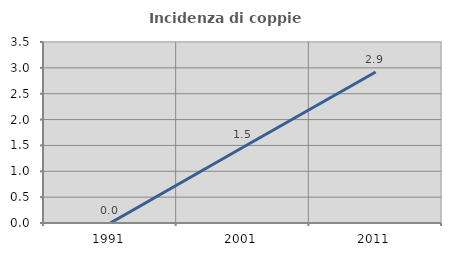
| Category | Incidenza di coppie miste |
|---|---|
| 1991.0 | 0 |
| 2001.0 | 1.465 |
| 2011.0 | 2.92 |